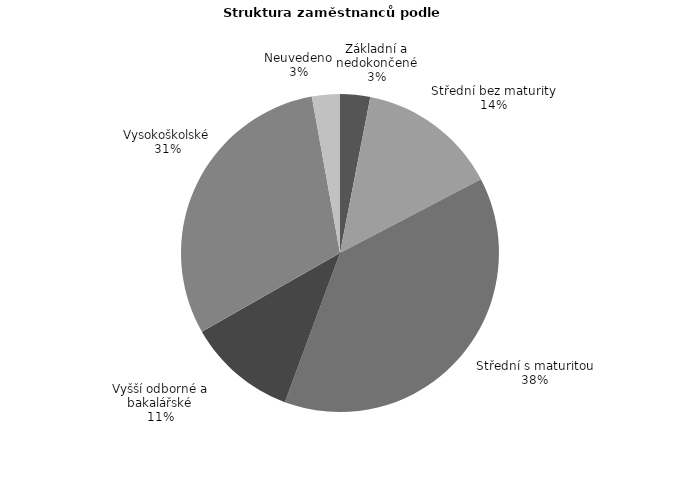
| Category | Series 0 |
|---|---|
| Základní a nedokončené | 19.478 |
| Střední bez maturity | 90.895 |
| Střední s maturitou | 243.873 |
| Vyšší odborné a bakalářské | 70.764 |
| Vysokoškolské | 193.634 |
| Neuvedeno | 18.058 |